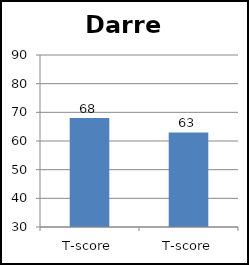
| Category | Darren |
|---|---|
| T-score | 68 |
| T-score | 63 |